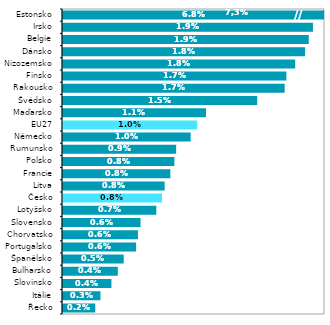
| Category | 2021* |
|---|---|
| Řecko | 0.002 |
| Itálie | 0.003 |
| Slovinsko | 0.004 |
| Bulharsko | 0.004 |
| Španělsko | 0.005 |
| Portugalsko | 0.006 |
| Chorvatsko | 0.006 |
| Slovensko | 0.006 |
| Lotyšsko | 0.007 |
| Česko | 0.008 |
| Litva | 0.008 |
| Francie | 0.008 |
| Polsko | 0.008 |
| Rumunsko | 0.009 |
| Německo | 0.01 |
| EU27 | 0.01 |
| Maďarsko | 0.011 |
| Švédsko | 0.015 |
| Rakousko | 0.017 |
| Finsko | 0.017 |
| Nizozemsko | 0.018 |
| Dánsko | 0.018 |
| Belgie | 0.019 |
| Irsko | 0.019 |
| Estonsko | 0.068 |